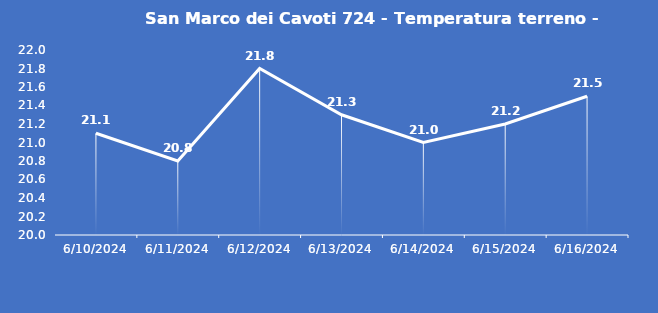
| Category | San Marco dei Cavoti 724 - Temperatura terreno - Grezzo (°C) |
|---|---|
| 6/10/24 | 21.1 |
| 6/11/24 | 20.8 |
| 6/12/24 | 21.8 |
| 6/13/24 | 21.3 |
| 6/14/24 | 21 |
| 6/15/24 | 21.2 |
| 6/16/24 | 21.5 |